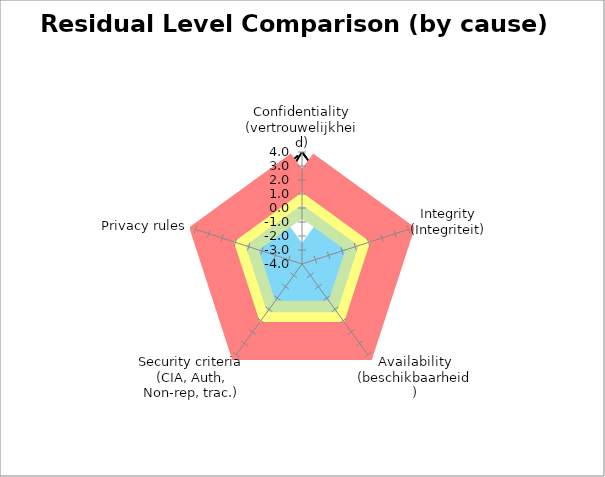
| Category | Average | Max | B | G | O | R |
|---|---|---|---|---|---|---|
| Confidentiality (vertrouwelijkheid) | 4 | 4 | -2.5 | 0 | 1 | 2.8 |
| Integrity (Integriteit) | 1 | 1 | -2.5 | 0 | 1 | 2.8 |
| Availability (beschikbaarheid) | 1 | 1 | -2.5 | 0 | 1 | 2.8 |
| Security criteria (CIA, Auth, Non-rep, trac.) | 0.333 | 1 | -2.5 | 0 | 1 | 2.8 |
| Privacy rules  | 0.308 | 3 | -2.5 | 0 | 1 | 2.8 |